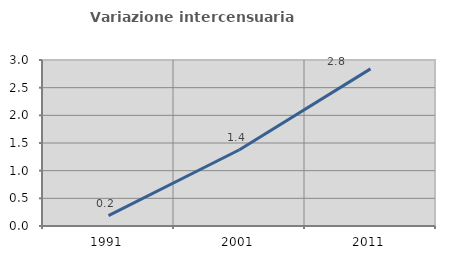
| Category | Variazione intercensuaria annua |
|---|---|
| 1991.0 | 0.189 |
| 2001.0 | 1.378 |
| 2011.0 | 2.84 |